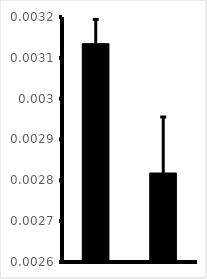
| Category | Series 0 |
|---|---|
| 0 | 0.003 |
| 1 | 0.003 |